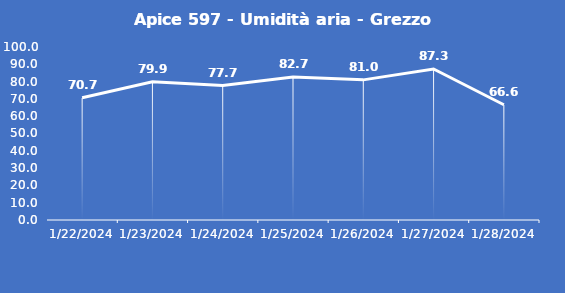
| Category | Apice 597 - Umidità aria - Grezzo (%) |
|---|---|
| 1/22/24 | 70.7 |
| 1/23/24 | 79.9 |
| 1/24/24 | 77.7 |
| 1/25/24 | 82.7 |
| 1/26/24 | 81 |
| 1/27/24 | 87.3 |
| 1/28/24 | 66.6 |